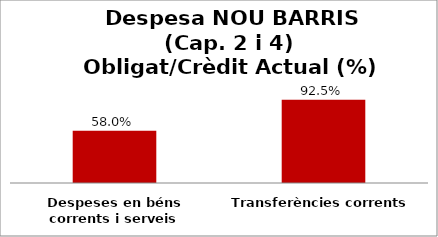
| Category | Series 0 |
|---|---|
| Despeses en béns corrents i serveis | 0.58 |
| Transferències corrents | 0.925 |